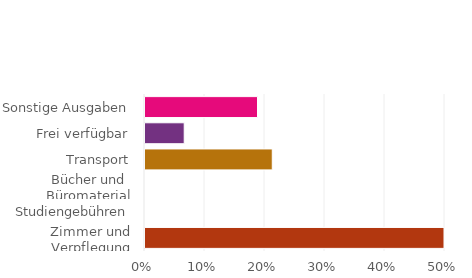
| Category | Series 0 |
|---|---|
| Zimmer und Verpflegung | 0.535 |
| Studiengebühren | 0 |
| Bücher und Büromaterial | 0 |
| Transport | 0.212 |
| Frei verfügbar | 0.065 |
| Sonstige Ausgaben | 0.188 |